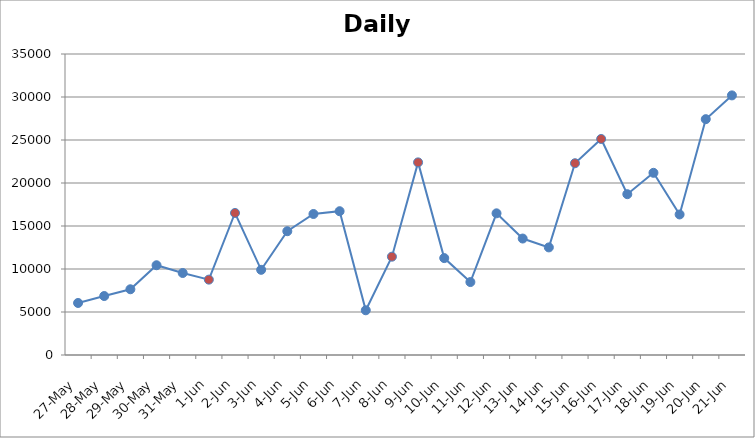
| Category | Daily Trips |
|---|---|
| 2013-05-27 | 6050 |
| 2013-05-28 | 6857 |
| 2013-05-29 | 7644 |
| 2013-05-30 | 10437 |
| 2013-05-31 | 9536 |
| 2013-06-01 | 8763 |
| 2013-06-02 | 16516 |
| 2013-06-03 | 9904 |
| 2013-06-04 | 14394 |
| 2013-06-05 | 16396 |
| 2013-06-06 | 16720 |
| 2013-06-07 | 5200 |
| 2013-06-08 | 11432 |
| 2013-06-09 | 22399 |
| 2013-06-10 | 11268 |
| 2013-06-11 | 8482 |
| 2013-06-12 | 16475 |
| 2013-06-13 | 13542 |
| 2013-06-14 | 12511 |
| 2013-06-15 | 22298 |
| 2013-06-16 | 25119 |
| 2013-06-17 | 18699 |
| 2013-06-18 | 21184 |
| 2013-06-19 | 16342 |
| 2013-06-20 | 27422 |
| 2013-06-21 | 30187 |